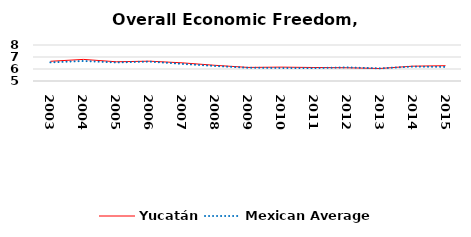
| Category | Yucatán | Mexican Average  |
|---|---|---|
| 2003.0 | 6.642 | 6.552 |
| 2004.0 | 6.8 | 6.668 |
| 2005.0 | 6.602 | 6.546 |
| 2006.0 | 6.652 | 6.619 |
| 2007.0 | 6.513 | 6.428 |
| 2008.0 | 6.307 | 6.248 |
| 2009.0 | 6.132 | 6.106 |
| 2010.0 | 6.156 | 6.086 |
| 2011.0 | 6.125 | 6.074 |
| 2012.0 | 6.105 | 6.134 |
| 2013.0 | 6.042 | 6.054 |
| 2014.0 | 6.234 | 6.2 |
| 2015.0 | 6.274 | 6.174 |